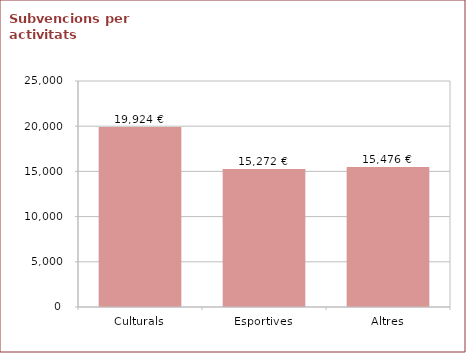
| Category | 2008-2009 |
|---|---|
| Culturals | 19924 |
| Esportives | 15272 |
| Altres | 15476 |